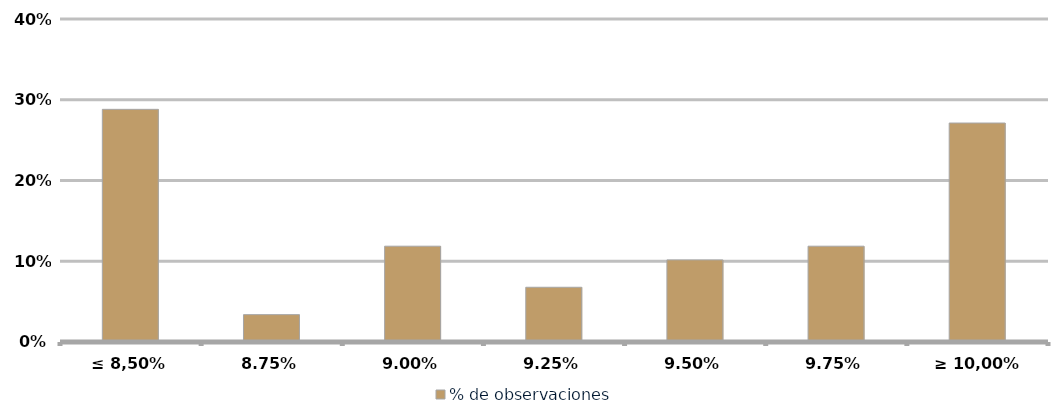
| Category | % de observaciones  |
|---|---|
| ≤ 8,50% | 0.288 |
| 8,75% | 0.034 |
| 9,00% | 0.119 |
| 9,25% | 0.068 |
| 9,50% | 0.102 |
| 9,75% | 0.119 |
| ≥ 10,00% | 0.271 |